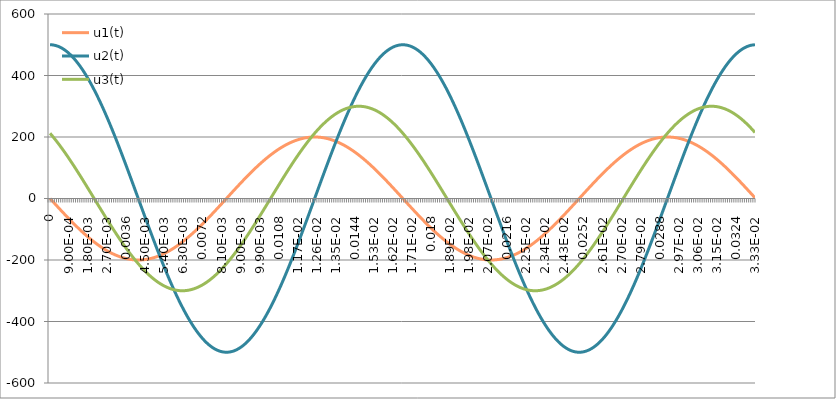
| Category | u1(t) | u2(t) | u3(t) |
|---|---|---|---|
| 0.0 | 0 | 500 | 212.132 |
| 0.0001 | -7.538 | 499.645 | 203.986 |
| 0.0002 | -15.066 | 498.579 | 195.55 |
| 0.0003 | -22.572 | 496.806 | 186.836 |
| 0.0004 | -30.046 | 494.326 | 177.856 |
| 0.0005 | -37.477 | 491.143 | 168.624 |
| 0.0006 | -44.855 | 487.263 | 159.152 |
| 0.0007 | -52.17 | 482.69 | 149.454 |
| 0.0008 | -59.41 | 477.431 | 139.543 |
| 0.0009 | -66.565 | 471.494 | 129.435 |
| 0.001 | -73.627 | 464.887 | 119.142 |
| 0.0011 | -80.583 | 457.619 | 108.68 |
| 0.0012 | -87.425 | 449.7 | 98.063 |
| 0.0013 | -94.143 | 441.143 | 87.308 |
| 0.0014 | -100.727 | 431.959 | 76.428 |
| 0.0015 | -107.168 | 422.16 | 65.439 |
| 0.0016 | -113.456 | 411.762 | 54.358 |
| 0.0017 | -119.583 | 400.779 | 43.199 |
| 0.0018 | -125.541 | 389.226 | 31.979 |
| 0.0019 | -131.32 | 377.12 | 20.713 |
| 0.002 | -136.912 | 364.478 | 9.418 |
| 0.0021 | -142.31 | 351.318 | -1.891 |
| 0.0022 | -147.505 | 337.659 | -13.196 |
| 0.0023 | -152.491 | 323.52 | -24.483 |
| 0.0024 | -157.26 | 308.921 | -35.735 |
| 0.0025 | -161.806 | 293.884 | -46.937 |
| 0.0026 | -166.122 | 278.428 | -58.072 |
| 0.0027 | -170.201 | 262.577 | -69.124 |
| 0.0028 | -174.039 | 246.353 | -80.078 |
| 0.0029 | -177.63 | 229.778 | -90.918 |
| 0.003 | -180.968 | 212.878 | -101.629 |
| 0.0031 | -184.049 | 195.674 | -112.195 |
| 0.0032 | -186.868 | 178.193 | -122.603 |
| 0.0033 | -189.422 | 160.458 | -132.835 |
| 0.0034 | -191.706 | 142.495 | -142.879 |
| 0.0035 | -193.718 | 124.33 | -152.72 |
| 0.0036 | -195.455 | 105.988 | -162.344 |
| 0.0037 | -196.914 | 87.495 | -171.738 |
| 0.0038 | -198.093 | 68.878 | -180.887 |
| 0.0039 | -198.991 | 50.164 | -189.779 |
| 0.004 | -199.606 | 31.378 | -198.402 |
| 0.0041 | -199.937 | 12.547 | -206.742 |
| 0.0042 | -199.984 | -6.302 | -214.789 |
| 0.0043 | -199.747 | -25.141 | -222.53 |
| 0.0044 | -199.226 | -43.945 | -229.955 |
| 0.0045 | -198.422 | -62.686 | -237.054 |
| 0.0046 | -197.336 | -81.339 | -243.815 |
| 0.0047 | -195.969 | -99.875 | -250.23 |
| 0.0048 | -194.324 | -118.27 | -256.29 |
| 0.0049 | -192.403 | -136.497 | -261.985 |
| 0.005 | -190.209 | -154.53 | -267.308 |
| 0.0051 | -187.744 | -172.343 | -272.251 |
| 0.0052 | -185.012 | -189.911 | -276.807 |
| 0.0053 | -182.017 | -207.209 | -280.97 |
| 0.0054 | -178.764 | -224.213 | -284.733 |
| 0.0055 | -175.257 | -240.898 | -288.092 |
| 0.0056 | -171.5 | -257.241 | -291.042 |
| 0.0057 | -167.5 | -273.218 | -293.577 |
| 0.0058 | -163.262 | -288.807 | -295.696 |
| 0.0059 | -158.792 | -303.986 | -297.394 |
| 0.006 | -154.096 | -318.733 | -298.67 |
| 0.0061 | -149.181 | -333.026 | -299.521 |
| 0.0062 | -144.054 | -346.846 | -299.947 |
| 0.0063 | -138.723 | -360.174 | -299.946 |
| 0.0064 | -133.194 | -372.99 | -299.52 |
| 0.0065 | -127.476 | -385.275 | -298.667 |
| 0.0066 | -121.577 | -397.013 | -297.39 |
| 0.0067 | -115.505 | -408.187 | -295.69 |
| 0.0068 | -109.269 | -418.781 | -293.571 |
| 0.0069 | -102.877 | -428.779 | -291.034 |
| 0.007 | -96.34 | -438.168 | -288.083 |
| 0.0071 | -89.665 | -446.935 | -284.723 |
| 0.0072 | -82.863 | -455.066 | -280.958 |
| 0.0073 | -75.944 | -462.551 | -276.794 |
| 0.0074 | -68.916 | -469.378 | -272.237 |
| 0.0075 | -61.791 | -475.539 | -267.293 |
| 0.0076 | -54.577 | -481.023 | -261.969 |
| 0.0077 | -47.287 | -485.824 | -256.273 |
| 0.0078 | -39.928 | -489.934 | -250.212 |
| 0.0079 | -32.514 | -493.349 | -243.796 |
| 0.008 | -25.053 | -496.062 | -237.033 |
| 0.0081 | -17.556 | -498.07 | -229.934 |
| 0.0082 | -10.034 | -499.37 | -222.508 |
| 0.0083 | -2.498 | -499.961 | -214.766 |
| 0.0084 | 5.041 | -499.841 | -206.718 |
| 0.0085 | 12.573 | -499.011 | -198.377 |
| 0.0086 | 20.088 | -497.472 | -189.753 |
| 0.0087 | 27.573 | -495.225 | -180.86 |
| 0.0088 | 35.02 | -492.275 | -171.71 |
| 0.0089 | 42.417 | -488.626 | -162.316 |
| 0.009 | 49.753 | -484.282 | -152.692 |
| 0.0091 | 57.019 | -479.249 | -142.85 |
| 0.0092 | 64.204 | -473.536 | -132.805 |
| 0.0093 | 71.298 | -467.15 | -122.572 |
| 0.0094 | 78.29 | -460.1 | -112.165 |
| 0.0095 | 85.171 | -452.396 | -101.598 |
| 0.0096 | 91.931 | -444.049 | -90.886 |
| 0.0097 | 98.56 | -435.071 | -80.046 |
| 0.0098 | 105.05 | -425.474 | -69.091 |
| 0.0099 | 111.39 | -415.273 | -58.039 |
| 0.01 | 117.571 | -404.482 | -46.904 |
| 0.0101 | 123.586 | -393.117 | -35.702 |
| 0.0102 | 129.425 | -381.192 | -24.45 |
| 0.0103 | 135.08 | -368.726 | -13.163 |
| 0.0104 | 140.543 | -355.735 | -1.857 |
| 0.0105 | 145.806 | -342.24 | 9.451 |
| 0.0106 | 150.863 | -328.257 | 20.746 |
| 0.0107 | 155.704 | -313.809 | 32.012 |
| 0.0108 | 160.325 | -298.914 | 43.232 |
| 0.0109 | 164.718 | -283.595 | 54.39 |
| 0.011 | 168.876 | -267.872 | 65.472 |
| 0.0111 | 172.795 | -251.769 | 76.46 |
| 0.0112 | 176.468 | -235.308 | 87.339 |
| 0.0113 | 179.89 | -218.513 | 98.095 |
| 0.0114 | 183.056 | -201.407 | 108.711 |
| 0.0115 | 185.963 | -184.015 | 119.172 |
| 0.0116 | 188.605 | -166.361 | 129.465 |
| 0.0117 | 190.979 | -148.471 | 139.573 |
| 0.0118 | 193.082 | -130.37 | 149.483 |
| 0.0119 | 194.91 | -112.084 | 159.18 |
| 0.012 | 196.461 | -93.638 | 168.651 |
| 0.0121 | 197.734 | -75.06 | 177.883 |
| 0.0122 | 198.725 | -56.374 | 186.862 |
| 0.0123 | 199.433 | -37.609 | 195.575 |
| 0.0124 | 199.859 | -18.79 | 204.01 |
| 0.0125 | 200 | 0.056 | 212.156 |
| 0.0126 | 199.857 | 18.901 | 219.999 |
| 0.0127 | 199.43 | 37.72 | 227.531 |
| 0.0128 | 198.72 | 56.485 | 234.738 |
| 0.0129 | 197.727 | 75.169 | 241.613 |
| 0.013 | 196.453 | 93.747 | 248.144 |
| 0.0131 | 194.9 | 112.192 | 254.322 |
| 0.0132 | 193.07 | 130.477 | 260.139 |
| 0.0133 | 190.966 | 148.577 | 265.586 |
| 0.0134 | 188.59 | 166.466 | 270.656 |
| 0.0135 | 185.946 | 184.118 | 275.341 |
| 0.0136 | 183.038 | 201.508 | 279.634 |
| 0.0137 | 179.87 | 218.613 | 283.531 |
| 0.0138 | 176.447 | 235.406 | 287.024 |
| 0.0139 | 172.772 | 251.865 | 290.11 |
| 0.014 | 168.852 | 267.966 | 292.783 |
| 0.0141 | 164.692 | 283.686 | 295.04 |
| 0.0142 | 160.298 | 299.003 | 296.878 |
| 0.0143 | 155.677 | 313.895 | 298.294 |
| 0.0144 | 150.833 | 328.341 | 299.286 |
| 0.0145 | 145.776 | 342.32 | 299.853 |
| 0.0146 | 140.512 | 355.813 | 299.994 |
| 0.0147 | 135.047 | 368.801 | 299.708 |
| 0.0148 | 129.391 | 381.264 | 298.997 |
| 0.0149 | 123.551 | 393.185 | 297.86 |
| 0.015 | 117.535 | 404.548 | 296.3 |
| 0.0151 | 111.353 | 415.335 | 294.319 |
| 0.0152 | 105.012 | 425.533 | 291.92 |
| 0.0153 | 98.522 | 435.125 | 289.106 |
| 0.0154 | 91.892 | 444.1 | 285.881 |
| 0.0155 | 85.131 | 452.443 | 282.25 |
| 0.0156 | 78.249 | 460.143 | 278.218 |
| 0.0157 | 71.256 | 467.189 | 273.79 |
| 0.0158 | 64.162 | 473.572 | 268.974 |
| 0.0159 | 56.977 | 479.281 | 263.775 |
| 0.016 | 49.71 | 484.309 | 258.201 |
| 0.0161 | 42.373 | 488.649 | 252.26 |
| 0.0162 | 34.976 | 492.295 | 245.961 |
| 0.0163 | 27.529 | 495.241 | 239.312 |
| 0.0164 | 20.043 | 497.483 | 232.323 |
| 0.0165 | 12.529 | 499.018 | 225.004 |
| 0.0166 | 4.997 | 499.844 | 217.365 |
| 0.0167 | -2.543 | 499.96 | 209.418 |
| 0.0168 | -10.079 | 499.365 | 201.172 |
| 0.0169 | -17.6 | 498.06 | 192.641 |
| 0.017 | -25.097 | 496.048 | 183.836 |
| 0.0171 | -32.557 | 493.331 | 174.77 |
| 0.0172 | -39.972 | 489.912 | 165.456 |
| 0.0173 | -47.33 | 485.798 | 155.906 |
| 0.0174 | -54.62 | 480.993 | 146.135 |
| 0.0175 | -61.833 | 475.504 | 136.156 |
| 0.0176 | -68.958 | 469.34 | 125.983 |
| 0.0177 | -75.985 | 462.509 | 115.632 |
| 0.0178 | -82.904 | 455.02 | 105.116 |
| 0.0179 | -89.705 | 446.885 | 94.451 |
| 0.018 | -96.379 | 438.115 | 83.651 |
| 0.0181 | -102.915 | 428.722 | 72.733 |
| 0.0182 | -109.306 | 418.72 | 61.711 |
| 0.0183 | -115.541 | 408.123 | 50.602 |
| 0.0184 | -121.612 | 396.946 | 39.421 |
| 0.0185 | -127.51 | 385.204 | 28.183 |
| 0.0186 | -133.227 | 372.916 | 16.906 |
| 0.0187 | -138.755 | 360.097 | 5.605 |
| 0.0188 | -144.085 | 346.767 | -5.705 |
| 0.0189 | -149.211 | 332.943 | -17.006 |
| 0.019 | -154.124 | 318.647 | -28.283 |
| 0.0191 | -158.819 | 303.898 | -39.52 |
| 0.0192 | -163.288 | 288.717 | -50.7 |
| 0.0193 | -167.524 | 273.125 | -61.809 |
| 0.0194 | -171.523 | 257.146 | -72.83 |
| 0.0195 | -175.278 | 240.801 | -83.747 |
| 0.0196 | -178.784 | 224.114 | -94.546 |
| 0.0197 | -182.036 | 207.108 | -105.209 |
| 0.0198 | -185.029 | 189.808 | -115.724 |
| 0.0199 | -187.759 | 172.239 | -126.074 |
| 0.02 | -190.222 | 154.424 | -136.245 |
| 0.0201 | -192.415 | 136.39 | -146.222 |
| 0.0202 | -194.335 | 118.162 | -155.991 |
| 0.0203 | -195.978 | 99.767 | -165.539 |
| 0.0204 | -197.343 | 81.229 | -174.851 |
| 0.0205 | -198.428 | 62.576 | -183.915 |
| 0.0206 | -199.23 | 43.834 | -192.718 |
| 0.0207 | -199.749 | 25.03 | -201.247 |
| 0.0208 | -199.985 | 6.191 | -209.489 |
| 0.0209 | -199.936 | -12.658 | -217.434 |
| 0.021 | -199.603 | -31.488 | -225.07 |
| 0.0211 | -198.986 | -50.274 | -232.386 |
| 0.0212 | -198.087 | -68.988 | -239.372 |
| 0.0213 | -196.906 | -87.605 | -246.018 |
| 0.0214 | -195.446 | -106.096 | -252.314 |
| 0.0215 | -193.707 | -124.437 | -258.252 |
| 0.0216 | -191.693 | -142.602 | -263.822 |
| 0.0217 | -189.407 | -160.563 | -269.018 |
| 0.0218 | -186.852 | -178.296 | -273.831 |
| 0.0219 | -184.031 | -195.776 | -278.255 |
| 0.022 | -180.949 | -212.978 | -282.284 |
| 0.0221 | -177.609 | -229.877 | -285.912 |
| 0.0222 | -174.017 | -246.449 | -289.133 |
| 0.0223 | -170.178 | -262.672 | -291.943 |
| 0.0224 | -166.097 | -278.52 | -294.339 |
| 0.0225 | -161.78 | -293.973 | -296.316 |
| 0.0226 | -157.233 | -309.009 | -297.872 |
| 0.0227 | -152.462 | -323.605 | -299.005 |
| 0.0228 | -147.475 | -337.741 | -299.713 |
| 0.0229 | -142.279 | -351.397 | -299.994 |
| 0.023 | -136.88 | -364.554 | -299.85 |
| 0.0231 | -131.286 | -377.193 | -299.279 |
| 0.0232 | -125.506 | -389.296 | -298.284 |
| 0.0233 | -119.548 | -400.845 | -296.864 |
| 0.0234 | -113.42 | -411.825 | -295.022 |
| 0.0235 | -107.13 | -422.22 | -292.761 |
| 0.0236 | -100.688 | -432.014 | -290.084 |
| 0.0237 | -94.104 | -441.195 | -286.995 |
| 0.0238 | -87.385 | -449.749 | -283.498 |
| 0.0239 | -80.542 | -457.663 | -279.598 |
| 0.024 | -73.585 | -464.927 | -275.301 |
| 0.0241 | -66.524 | -471.531 | -270.612 |
| 0.0242 | -59.367 | -477.464 | -265.539 |
| 0.0243 | -52.127 | -482.719 | -260.089 |
| 0.0244 | -44.812 | -487.288 | -254.269 |
| 0.0245 | -37.434 | -491.164 | -248.087 |
| 0.0246 | -30.002 | -494.342 | -241.554 |
| 0.0247 | -22.528 | -496.818 | -234.676 |
| 0.0248 | -15.021 | -498.588 | -227.465 |
| 0.0249 | -7.494 | -499.649 | -219.931 |
| 0.025 | 0.044 | -500 | -212.085 |
| 0.0251 | 7.583 | -499.641 | -203.937 |
| 0.0252 | 15.11 | -498.571 | -195.499 |
| 0.0253 | 22.616 | -496.793 | -186.784 |
| 0.0254 | 30.09 | -494.309 | -177.803 |
| 0.0255 | 37.521 | -491.122 | -168.569 |
| 0.0256 | 44.898 | -487.238 | -159.096 |
| 0.0257 | 52.212 | -482.661 | -149.396 |
| 0.0258 | 59.452 | -477.398 | -139.484 |
| 0.0259 | 66.607 | -471.457 | -129.375 |
| 0.026 | 73.668 | -464.846 | -119.081 |
| 0.0261 | 80.624 | -457.574 | -108.618 |
| 0.0262 | 87.465 | -449.652 | -98 |
| 0.0263 | 94.182 | -441.091 | -87.244 |
| 0.0264 | 100.765 | -431.903 | -76.363 |
| 0.0265 | 107.205 | -422.101 | -65.374 |
| 0.0266 | 113.493 | -411.699 | -54.292 |
| 0.0267 | 119.619 | -400.713 | -43.133 |
| 0.0268 | 125.575 | -389.156 | -31.912 |
| 0.0269 | 131.353 | -377.047 | -20.647 |
| 0.027 | 136.944 | -364.402 | -9.351 |
| 0.0271 | 142.341 | -351.239 | 1.957 |
| 0.0272 | 147.535 | -337.577 | 13.263 |
| 0.0273 | 152.52 | -323.436 | 24.55 |
| 0.0274 | 157.288 | -308.834 | 35.802 |
| 0.0275 | 161.832 | -293.794 | 47.003 |
| 0.0276 | 166.146 | -278.336 | 58.137 |
| 0.0277 | 170.225 | -262.483 | 69.189 |
| 0.0278 | 174.061 | -246.256 | 80.142 |
| 0.0279 | 177.65 | -229.68 | 90.981 |
| 0.028 | 180.987 | -212.777 | 101.692 |
| 0.0281 | 184.066 | -195.572 | 112.257 |
| 0.0282 | 186.884 | -178.089 | 122.663 |
| 0.0283 | 189.436 | -160.353 | 132.895 |
| 0.0284 | 191.719 | -142.389 | 142.938 |
| 0.0285 | 193.729 | -124.222 | 152.778 |
| 0.0286 | 195.464 | -105.879 | 162.4 |
| 0.0287 | 196.922 | -87.386 | 171.792 |
| 0.0288 | 198.099 | -68.768 | 180.94 |
| 0.0289 | 198.995 | -50.053 | 189.831 |
| 0.029 | 199.609 | -31.267 | 198.452 |
| 0.0291 | 199.938 | -12.436 | 206.79 |
| 0.0292 | 199.984 | 6.413 | 214.835 |
| 0.0293 | 199.745 | 25.252 | 222.575 |
| 0.0294 | 199.222 | 44.056 | 229.998 |
| 0.0295 | 198.416 | 62.797 | 237.095 |
| 0.0296 | 197.329 | 81.448 | 243.854 |
| 0.0297 | 195.96 | 99.984 | 250.267 |
| 0.0298 | 194.314 | 118.378 | 256.324 |
| 0.0299 | 192.391 | 136.604 | 262.018 |
| 0.03 | 190.195 | 154.635 | 267.338 |
| 0.0301 | 187.728 | 172.447 | 272.279 |
| 0.0302 | 184.995 | 190.014 | 276.833 |
| 0.0303 | 181.999 | 207.31 | 280.993 |
| 0.0304 | 178.744 | 224.312 | 284.754 |
| 0.0305 | 175.235 | 240.996 | 288.111 |
| 0.0306 | 171.477 | 257.336 | 291.058 |
| 0.0307 | 167.476 | 273.311 | 293.591 |
| 0.0308 | 163.236 | 288.898 | 295.707 |
| 0.0309 | 158.765 | 304.074 | 297.403 |
| 0.031 | 154.068 | 318.818 | 298.676 |
| 0.0311 | 149.151 | 333.109 | 299.525 |
| 0.0312 | 144.023 | 346.926 | 299.948 |
| 0.0313 | 138.691 | 360.251 | 299.945 |
| 0.0314 | 133.161 | 373.063 | 299.516 |
| 0.0315 | 127.442 | 385.346 | 298.661 |
| 0.0316 | 121.541 | 397.08 | 297.381 |
| 0.0317 | 115.469 | 408.251 | 295.679 |
| 0.0318 | 109.232 | 418.841 | 293.557 |
| 0.0319 | 102.839 | 428.836 | 291.017 |
| 0.032 | 96.301 | 438.222 | 288.064 |
| 0.0321 | 89.626 | 446.985 | 284.702 |
| 0.0322 | 82.823 | 455.112 | 280.935 |
| 0.0323 | 75.903 | 462.593 | 276.769 |
| 0.0324 | 68.875 | 469.416 | 272.209 |
| 0.0325 | 61.748 | 475.573 | 267.263 |
| 0.0326 | 54.535 | 481.053 | 261.936 |
| 0.0327 | 47.243 | 485.85 | 256.238 |
| 0.0328 | 39.885 | 489.957 | 250.175 |
| 0.0329 | 32.47 | 493.367 | 243.757 |
| 0.033 | 25.008 | 496.076 | 236.993 |
| 0.0331 | 17.512 | 498.08 | 229.891 |
| 0.0332 | 9.99 | 499.376 | 222.463 |
| 0.0333 | 2.454 | 499.962 | 214.719 |